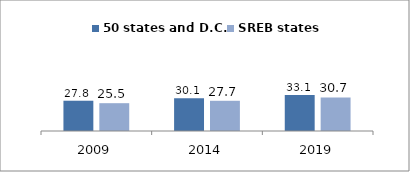
| Category | 50 states and D.C. | SREB states |
|---|---|---|
| 2009.0 | 27.772 | 25.522 |
| 2014.0 | 30.064 | 27.718 |
| 2019.0 | 33.127 | 30.742 |